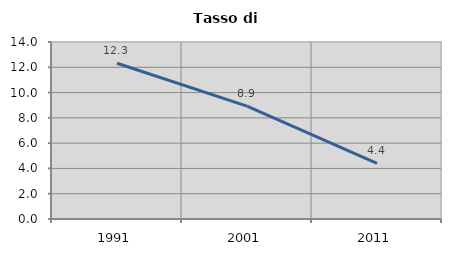
| Category | Tasso di disoccupazione   |
|---|---|
| 1991.0 | 12.321 |
| 2001.0 | 8.923 |
| 2011.0 | 4.399 |